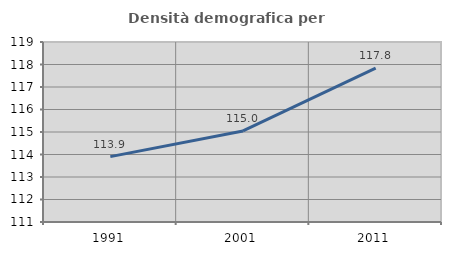
| Category | Densità demografica |
|---|---|
| 1991.0 | 113.905 |
| 2001.0 | 115.048 |
| 2011.0 | 117.841 |